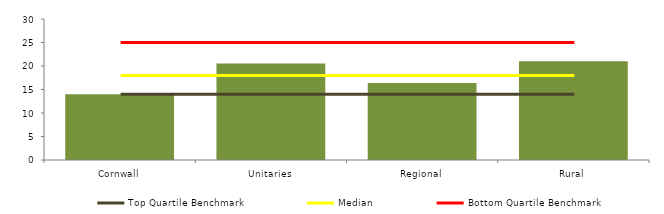
| Category | Block Data |
|---|---|
| Cornwall | 14 |
| Unitaries | 20.526 |
| Regional | 16.364 |
|  Rural  | 21 |